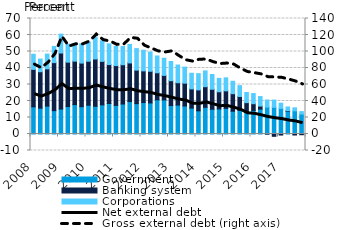
| Category | Government | Banking system | Corporations |
|---|---|---|---|
| 2008.0 | 16.458 | 22.717 | 9.14 |
| 2008.0 | 15.678 | 22.055 | 7.675 |
| 2008.0 | 16.911 | 22.584 | 8.93 |
| 2008.0 | 14.165 | 29.091 | 9.81 |
| 2009.0 | 15.12 | 33.952 | 11.428 |
| 2009.0 | 16.633 | 26.901 | 10.915 |
| 2009.0 | 17.803 | 26.337 | 10.762 |
| 2009.0 | 16.57 | 26.423 | 11.68 |
| 2010.0 | 17.44 | 26.648 | 11.56 |
| 2010.0 | 16.789 | 28.67 | 13.269 |
| 2010.0 | 17.654 | 26.372 | 12.438 |
| 2010.0 | 18.488 | 23.599 | 12.53 |
| 2011.0 | 17.326 | 24.136 | 11.631 |
| 2011.0 | 18.16 | 23.834 | 10.999 |
| 2011.0 | 19.654 | 23.412 | 11.221 |
| 2011.0 | 18.396 | 20.305 | 13.058 |
| 2012.0 | 19.065 | 19.204 | 12.504 |
| 2012.0 | 18.824 | 19.213 | 11.61 |
| 2012.0 | 20.746 | 16.378 | 10.159 |
| 2012.0 | 20.671 | 14.844 | 10.407 |
| 2013.0 | 17.237 | 15.065 | 11.622 |
| 2013.0 | 17.514 | 13.574 | 10.72 |
| 2013.0 | 16.981 | 13.818 | 9.731 |
| 2013.0 | 15.691 | 11.651 | 9.472 |
| 2014.0 | 14.036 | 12.686 | 9.85 |
| 2014.0 | 16.184 | 12.491 | 9.552 |
| 2014.0 | 15.007 | 12.102 | 8.952 |
| 2014.0 | 15.185 | 10.409 | 8.114 |
| 2015.0 | 15.517 | 10.639 | 7.886 |
| 2015.0 | 13.799 | 10.641 | 7.534 |
| 2015.0 | 14.281 | 8.468 | 6.565 |
| 2015.0 | 13.228 | 5.779 | 6.14 |
| 2016.0 | 14.317 | 4.04 | 6.154 |
| 2016.0 | 15.082 | 1.844 | 5.758 |
| 2016.0 | 16.322 | -0.085 | 4.28 |
| 2016.0 | 16.18 | -1.412 | 4.388 |
| 2017.0 | 15.523 | -0.633 | 3.157 |
| 2017.0 | 13.807 | 0.353 | 2.217 |
| 2017.0 | 14.058 | -0.619 | 1.788 |
| 2017.0 | 12.073 | -0.443 | 1.49 |